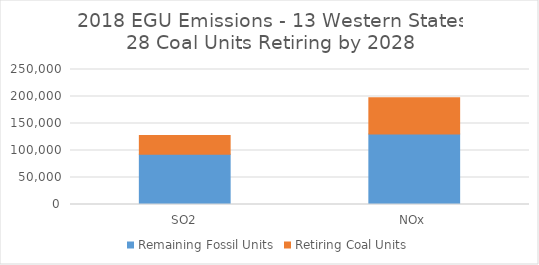
| Category | Remaining Fossil Units | Retiring Coal Units |
|---|---|---|
| SO2 | 92983.247 | 34564.499 |
| NOx | 130645.244 | 66860.71 |